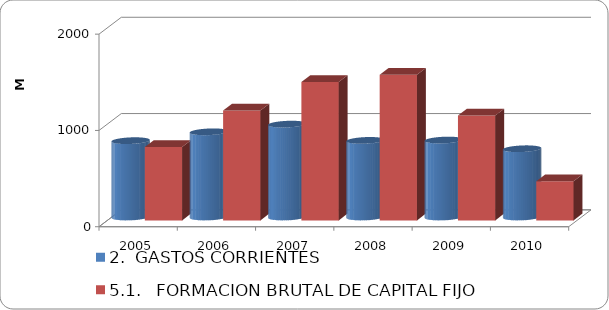
| Category | 2.  GASTOS CORRIENTES | 5.1.   FORMACION BRUTAL DE CAPITAL FIJO |
|---|---|---|
| 2005 | 792.746 | 761.83 |
| 2006 | 884.864 | 1140.299 |
| 2007 | 964.528 | 1437.026 |
| 2008 | 795.655 | 1511.154 |
| 2009 | 799.237 | 1087.961 |
| 2010 | 708.912 | 405.122 |